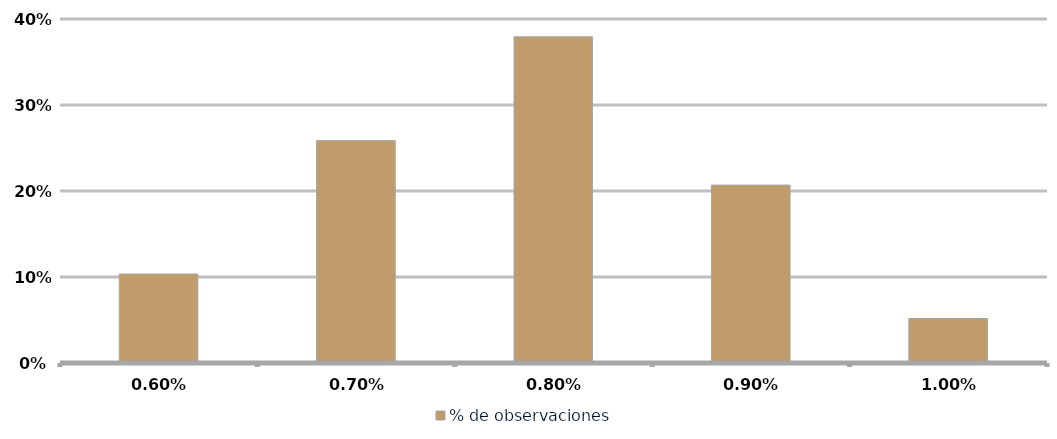
| Category | % de observaciones  |
|---|---|
| 0.006 | 0.103 |
| 0.007 | 0.259 |
| 0.008 | 0.379 |
| 0.009000000000000001 | 0.207 |
| 0.010000000000000002 | 0.052 |